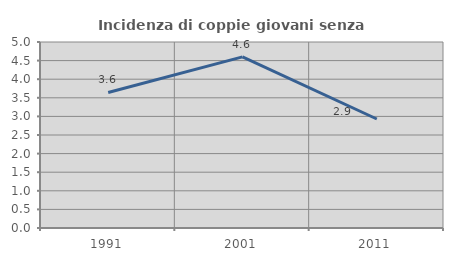
| Category | Incidenza di coppie giovani senza figli |
|---|---|
| 1991.0 | 3.643 |
| 2001.0 | 4.6 |
| 2011.0 | 2.93 |